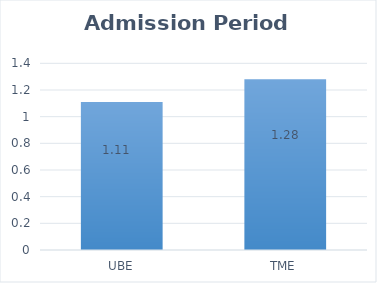
| Category | Series 0 |
|---|---|
| UBE | 1.11 |
| TME | 1.28 |